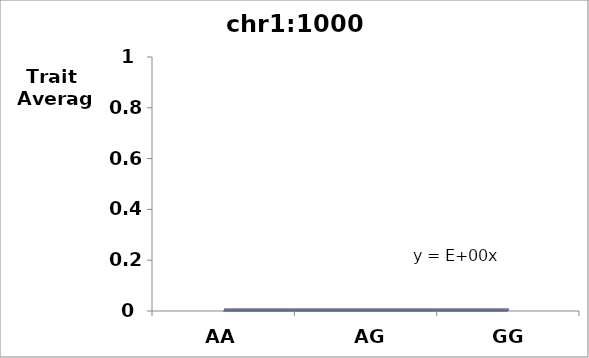
| Category | Score |
|---|---|
| AA | 0 |
| AG | 0 |
| GG | 0 |